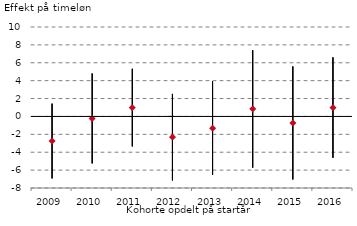
| Category | Øvre 95% | Nedre 95% | Koef. |
|---|---|---|---|
| 2009.0 | 1.43 | -6.931 | -2.75 |
| 2010.0 | 4.803 | -5.251 | -0.224 |
| 2011.0 | 5.328 | -3.352 | 0.988 |
| 2012.0 | 2.522 | -7.154 | -2.316 |
| 2013.0 | 3.915 | -6.544 | -1.314 |
| 2014.0 | 7.404 | -5.724 | 0.84 |
| 2015.0 | 5.59 | -7.045 | -0.727 |
| 2016.0 | 6.603 | -4.62 | 0.991 |